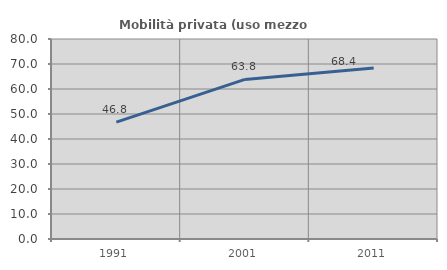
| Category | Mobilità privata (uso mezzo privato) |
|---|---|
| 1991.0 | 46.763 |
| 2001.0 | 63.83 |
| 2011.0 | 68.376 |